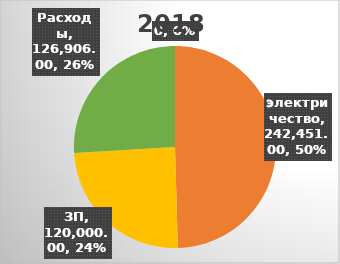
| Category | Series 0 |
|---|---|
| электричество | 242451 |
| ЗП | 120000 |
| Расходы | 126906 |